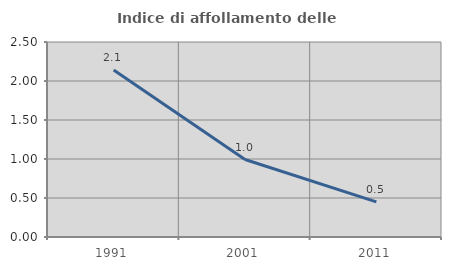
| Category | Indice di affollamento delle abitazioni  |
|---|---|
| 1991.0 | 2.14 |
| 2001.0 | 0.993 |
| 2011.0 | 0.45 |